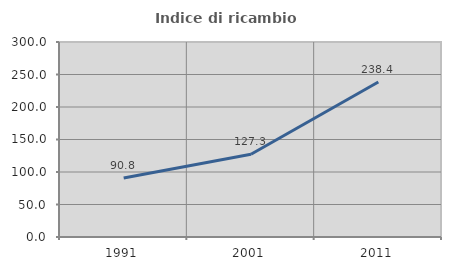
| Category | Indice di ricambio occupazionale  |
|---|---|
| 1991.0 | 90.833 |
| 2001.0 | 127.313 |
| 2011.0 | 238.406 |